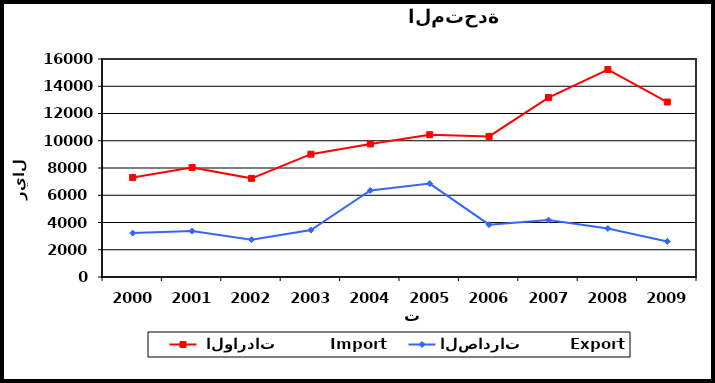
| Category |  الواردات           Import | الصادرات          Export |
|---|---|---|
| 2000.0 | 7308 | 3223 |
| 2001.0 | 8037 | 3369 |
| 2002.0 | 7240 | 2740 |
| 2003.0 | 9014 | 3443 |
| 2004.0 | 9767 | 6353 |
| 2005.0 | 10443 | 6855 |
| 2006.0 | 10318 | 3843 |
| 2007.0 | 13170 | 4175 |
| 2008.0 | 15225 | 3562 |
| 2009.0 | 12842 | 2612 |